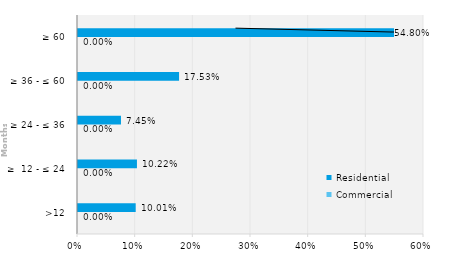
| Category | Commercial | Residential |
|---|---|---|
| >12 | 0 | 0.1 |
| ≥  12 - ≤ 24 | 0 | 0.102 |
| ≥ 24 - ≤ 36 | 0 | 0.075 |
| ≥ 36 - ≤ 60 | 0 | 0.175 |
| ≥ 60 | 0 | 0.548 |